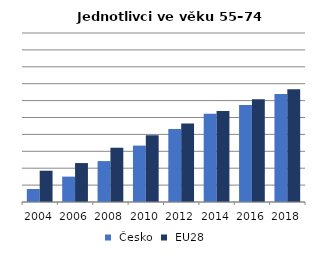
| Category |  Česko |  EU28 |
|---|---|---|
| 2004.0 | 7.701 | 18.512 |
| 2006.0 | 15.018 | 23.042 |
| 2008.0 | 24.2 | 32.11 |
| 2010.0 | 33.367 | 39.562 |
| 2012.0 | 43.138 | 46.41 |
| 2014.0 | 52.147 | 53.849 |
| 2016.0 | 57.362 | 60.866 |
| 2018.0 | 63.968 | 66.726 |